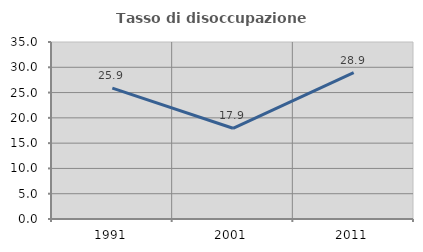
| Category | Tasso di disoccupazione giovanile  |
|---|---|
| 1991.0 | 25.888 |
| 2001.0 | 17.938 |
| 2011.0 | 28.942 |